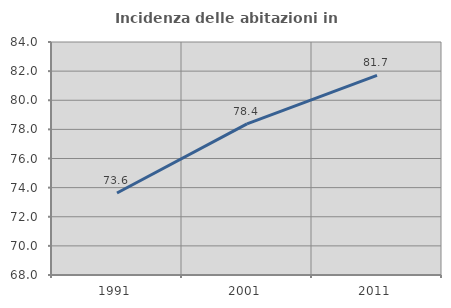
| Category | Incidenza delle abitazioni in proprietà  |
|---|---|
| 1991.0 | 73.628 |
| 2001.0 | 78.381 |
| 2011.0 | 81.702 |